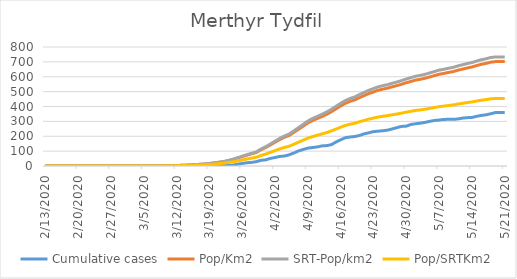
| Category | Cumulative cases | Pop/Km2 | SRT-Pop/km2 | Pop/SRTKm2 |
|---|---|---|---|---|
| 5/21/20 | 359 | 701.839 | 733.381 | 454.052 |
| 5/20/20 | 359 | 701.839 | 733.381 | 454.052 |
| 5/19/20 | 359 | 701.674 | 733.209 | 453.946 |
| 5/18/20 | 351 | 697.827 | 729.189 | 451.457 |
| 5/17/20 | 344 | 689.639 | 720.632 | 446.159 |
| 5/16/20 | 340 | 683.539 | 714.258 | 442.213 |
| 5/15/20 | 334 | 674.966 | 705.3 | 436.667 |
| 5/14/20 | 326 | 665.458 | 695.365 | 430.516 |
| 5/13/20 | 325 | 658.864 | 688.474 | 426.249 |
| 5/12/20 | 322 | 651.28 | 680.549 | 421.343 |
| 5/11/20 | 316 | 643.751 | 672.682 | 416.472 |
| 5/10/20 | 314 | 634.408 | 662.92 | 410.428 |
| 5/9/20 | 314 | 628.968 | 657.235 | 406.908 |
| 5/8/20 | 313 | 622.153 | 650.114 | 402.5 |
| 5/7/20 | 309 | 616.658 | 644.371 | 398.944 |
| 5/6/20 | 306 | 607.59 | 634.896 | 393.078 |
| 5/5/20 | 300 | 598.522 | 625.421 | 387.212 |
| 5/4/20 | 293 | 589.784 | 616.29 | 381.559 |
| 5/3/20 | 288 | 582.75 | 608.94 | 377.008 |
| 5/2/20 | 284 | 577.584 | 603.542 | 373.666 |
| 5/1/20 | 279 | 568.406 | 593.952 | 367.729 |
| 4/30/20 | 268 | 559.724 | 584.879 | 362.111 |
| 4/29/20 | 266 | 549.172 | 573.853 | 355.285 |
| 4/28/20 | 258 | 540.214 | 564.492 | 349.49 |
| 4/27/20 | 249 | 532.191 | 556.108 | 344.299 |
| 4/26/20 | 241 | 523.178 | 546.691 | 338.468 |
| 4/25/20 | 237 | 516.638 | 539.857 | 334.237 |
| 4/24/20 | 234 | 509.219 | 532.104 | 329.438 |
| 4/23/20 | 231 | 497.843 | 520.217 | 322.078 |
| 4/22/20 | 223 | 486.962 | 508.847 | 315.038 |
| 4/21/20 | 216 | 473.168 | 494.433 | 306.115 |
| 4/20/20 | 205 | 459.265 | 479.905 | 297.12 |
| 4/19/20 | 198 | 444.152 | 464.113 | 287.342 |
| 4/18/20 | 195 | 434.37 | 453.891 | 281.014 |
| 4/17/20 | 190 | 421.015 | 439.937 | 272.374 |
| 4/16/20 | 176 | 403.32 | 421.446 | 260.926 |
| 4/15/20 | 161 | 383.591 | 400.83 | 248.163 |
| 4/14/20 | 143 | 364.081 | 380.444 | 235.541 |
| 4/13/20 | 137 | 347.045 | 362.642 | 224.52 |
| 4/12/20 | 135 | 332.372 | 347.309 | 215.027 |
| 4/11/20 | 128 | 319.018 | 333.355 | 206.387 |
| 4/10/20 | 124 | 305.608 | 319.343 | 197.712 |
| 4/9/20 | 120 | 289.122 | 302.115 | 187.046 |
| 4/8/20 | 111 | 267.689 | 279.72 | 173.181 |
| 4/7/20 | 101 | 246.641 | 257.726 | 159.564 |
| 4/6/20 | 87 | 225.978 | 236.134 | 146.195 |
| 4/5/20 | 75 | 205.15 | 214.369 | 132.721 |
| 4/4/20 | 67 | 193.004 | 201.678 | 124.863 |
| 4/3/20 | 64 | 177.562 | 185.542 | 114.873 |
| 4/2/20 | 57 | 159.756 | 166.936 | 103.354 |
| 4/1/20 | 51 | 141.456 | 147.813 | 91.514 |
| 3/31/20 | 41 | 123.87 | 129.437 | 80.137 |
| 3/30/20 | 38 | 108.977 | 113.875 | 70.502 |
| 3/29/20 | 29 | 90.622 | 94.695 | 58.628 |
| 3/28/20 | 24 | 82.049 | 85.736 | 53.081 |
| 3/27/20 | 22 | 72.926 | 76.204 | 47.179 |
| 3/26/20 | 17 | 62.759 | 65.58 | 40.602 |
| 3/25/20 | 12 | 53.197 | 55.588 | 34.416 |
| 3/24/20 | 6 | 43.14 | 45.079 | 27.909 |
| 3/23/20 | 4 | 35.721 | 37.327 | 23.11 |
| 3/22/20 | 3 | 28.577 | 29.861 | 18.488 |
| 3/21/20 | 3 | 24.4 | 25.497 | 15.786 |
| 3/20/20 | 2 | 20.279 | 21.19 | 13.119 |
| 3/19/20 | 2 | 16.322 | 17.055 | 10.559 |
| 3/18/20 | 1 | 13.024 | 13.61 | 8.426 |
| 3/17/20 | 1 | 11.101 | 11.6 | 7.182 |
| 3/16/20 | 1 | 9.068 | 9.475 | 5.866 |
| 3/15/20 | 0 | 7.199 | 7.523 | 4.657 |
| 3/14/20 | 0 | 5.605 | 5.857 | 3.626 |
| 3/13/20 | 0 | 4.561 | 4.766 | 2.951 |
| 3/12/20 | 0 | 3.078 | 3.216 | 1.991 |
| 3/11/20 | 0 | 1.759 | 1.838 | 1.138 |
| 3/10/20 | 0 | 0.989 | 1.034 | 0.64 |
| 3/9/20 | 0 | 0.385 | 0.402 | 0.249 |
| 3/8/20 | 0 | 0.22 | 0.23 | 0.142 |
| 3/7/20 | 0 | 0.22 | 0.23 | 0.142 |
| 3/6/20 | 0 | 0.11 | 0.115 | 0.071 |
| 3/5/20 | 0 | 0.11 | 0.115 | 0.071 |
| 3/4/20 | 0 | 0.11 | 0.115 | 0.071 |
| 3/3/20 | 0 | 0.055 | 0.057 | 0.036 |
| 3/2/20 | 0 | 0.055 | 0.057 | 0.036 |
| 3/1/20 | 0 | 0.055 | 0.057 | 0.036 |
| 2/29/20 | 0 | 0.055 | 0.057 | 0.036 |
| 2/28/20 | 0 | 0.055 | 0.057 | 0.036 |
| 2/27/20 | 0 | 0.055 | 0.057 | 0.036 |
| 2/26/20 | 0 | 0 | 0 | 0 |
| 2/25/20 | 0 | 0 | 0 | 0 |
| 2/24/20 | 0 | 0 | 0 | 0 |
| 2/23/20 | 0 | 0 | 0 | 0 |
| 2/22/20 | 0 | 0 | 0 | 0 |
| 2/21/20 | 0 | 0 | 0 | 0 |
| 2/20/20 | 0 | 0 | 0 | 0 |
| 2/19/20 | 0 | 0 | 0 | 0 |
| 2/18/20 | 0 | 0 | 0 | 0 |
| 2/17/20 | 0 | 0 | 0 | 0 |
| 2/16/20 | 0 | 0 | 0 | 0 |
| 2/15/20 | 0 | 0 | 0 | 0 |
| 2/14/20 | 0 | 0 | 0 | 0 |
| 2/13/20 | 0 | 0 | 0 | 0 |